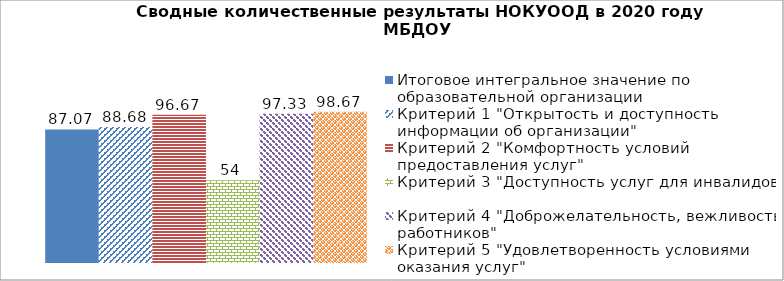
| Category | Итоговое интегральное значение по образовательной организации | Критерий 1 "Открытость и доступность информации об организации" | Критерий 2 "Комфортность условий предоставления услуг" | Критерий 3 "Доступность услуг для инвалидов" | Критерий 4 "Доброжелательность, вежливость работников" | Критерий 5 "Удовлетворенность условиями оказания услуг" |
|---|---|---|---|---|---|---|
| 0 | 87.07 | 88.68 | 96.67 | 54 | 97.33 | 98.67 |